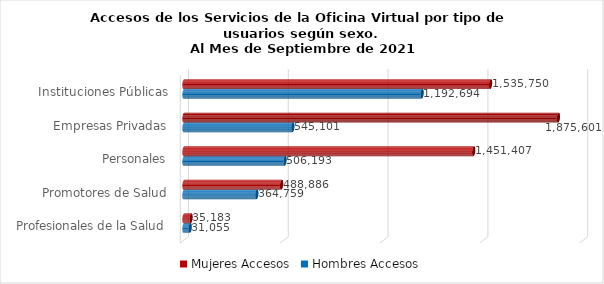
| Category | Mujeres | Hombres |
|---|---|---|
| Instituciones Públicas | 1535750 | 1192694 |
| Empresas Privadas | 1875601 | 545101 |
| Personales | 1451407 | 506193 |
| Promotores de Salud | 488886 | 364759 |
| Profesionales de la Salud | 35183 | 31055 |